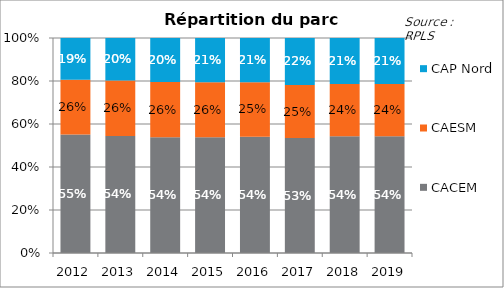
| Category | CACEM | CAESM | CAP Nord |
|---|---|---|---|
| 2012.0 | 0.551 | 0.255 | 0.194 |
| 2013.0 | 0.544 | 0.258 | 0.198 |
| 2014.0 | 0.538 | 0.257 | 0.205 |
| 2015.0 | 0.538 | 0.256 | 0.206 |
| 2016.0 | 0.541 | 0.253 | 0.206 |
| 2017.0 | 0.534 | 0.247 | 0.218 |
| 2018.0 | 0.543 | 0.243 | 0.214 |
| 2019.0 | 0.543 | 0.243 | 0.214 |